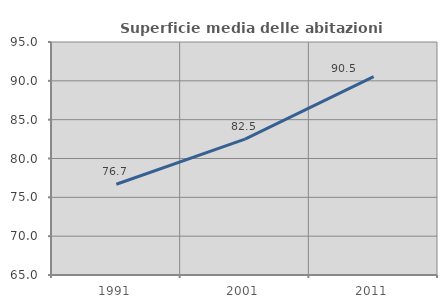
| Category | Superficie media delle abitazioni occupate |
|---|---|
| 1991.0 | 76.689 |
| 2001.0 | 82.503 |
| 2011.0 | 90.547 |